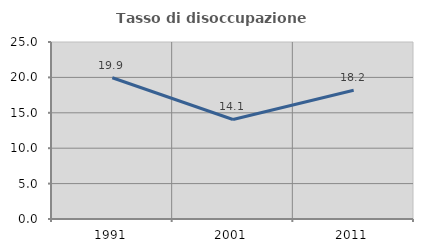
| Category | Tasso di disoccupazione giovanile  |
|---|---|
| 1991.0 | 19.946 |
| 2001.0 | 14.056 |
| 2011.0 | 18.182 |